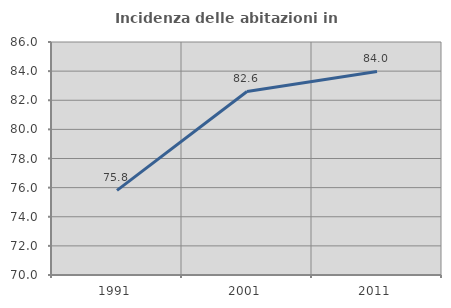
| Category | Incidenza delle abitazioni in proprietà  |
|---|---|
| 1991.0 | 75.814 |
| 2001.0 | 82.602 |
| 2011.0 | 83.977 |